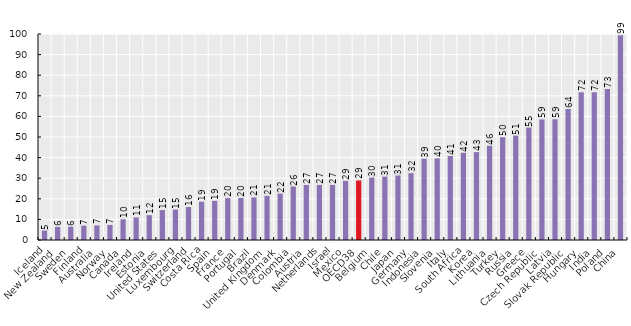
| Category | Series 0 |
|---|---|
| Iceland | 4.584 |
| New Zealand | 6.33 |
| Sweden | 6.464 |
| Finland | 6.965 |
| Australia | 7.073 |
| Norway | 7.311 |
| Canada | 10.068 |
| Ireland | 10.971 |
| Estonia | 12.048 |
| United States | 14.526 |
| Luxembourg | 14.791 |
| Switzerland | 16.005 |
| Costa Rica | 18.584 |
| Spain | 18.999 |
| France | 20.343 |
| Portugal | 20.388 |
| Brazil | 20.657 |
| United Kingdom | 21.412 |
| Denmark | 22.493 |
| Colombia | 25.956 |
| Austria | 26.722 |
| Netherlands | 26.726 |
| Israel | 26.757 |
| Mexico | 28.688 |
| OECD38 | 28.895 |
| Belgium | 30.281 |
| Chile | 30.753 |
| Japan | 31.308 |
| Germany | 32.429 |
| Indonesia | 39.45 |
| Slovenia | 39.61 |
| Italy | 40.781 |
| South Africa | 42.341 |
| Korea | 42.667 |
| Lithuania | 45.716 |
| Turkey | 49.923 |
| Russia | 50.677 |
| Greece | 54.587 |
| Czech Republic | 58.526 |
| Latvia | 58.619 |
| Slovak Republic | 63.649 |
| Hungary | 71.665 |
| India | 71.717 |
| Poland | 73.282 |
| China | 99.358 |